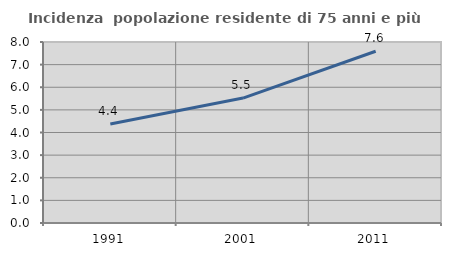
| Category | Incidenza  popolazione residente di 75 anni e più |
|---|---|
| 1991.0 | 4.38 |
| 2001.0 | 5.522 |
| 2011.0 | 7.593 |